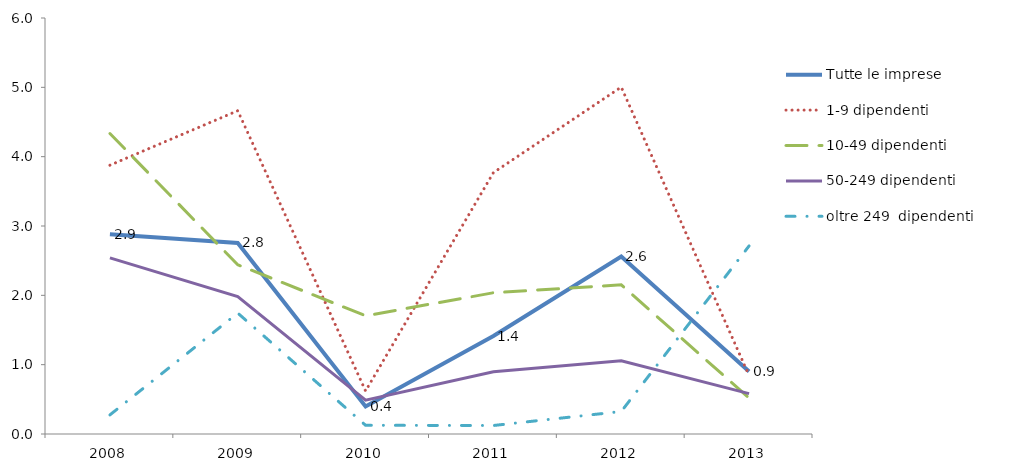
| Category | Tutte le imprese | 1-9 dipendenti | 10-49 dipendenti | 50-249 dipendenti | oltre 249  dipendenti |
|---|---|---|---|---|---|
| 2008.0 | 2.879 | 3.877 | 4.334 | 2.54 | 0.275 |
| 2009.0 | 2.756 | 4.663 | 2.441 | 1.981 | 1.744 |
| 2010.0 | 0.397 | 0.621 | 1.705 | 0.487 | 0.126 |
| 2011.0 | 1.413 | 3.77 | 2.037 | 0.897 | 0.123 |
| 2012.0 | 2.561 | 5.003 | 2.151 | 1.057 | 0.325 |
| 2013.0 | 0.901 | 0.842 | 0.519 | 0.583 | 2.713 |